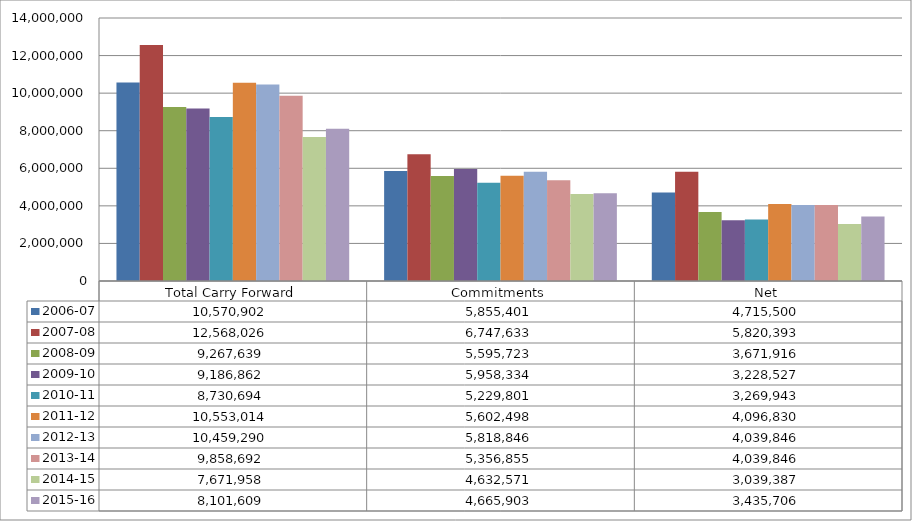
| Category | 2006-07 | 2007-08 | 2008-09 | 2009-10 | 2010-11 | 2011-12 | 2012-13 | 2013-14 | 2014-15 | 2015-16 |
|---|---|---|---|---|---|---|---|---|---|---|
| Total Carry Forward | 10570901.71 | 12568026 | 9267638.53 | 9186861.57 | 8730694 | 10553014 | 10459290 | 9858692 | 7671958.49 | 8101609.11 |
| Commitments | 5855401.23 | 6747633 | 5595723 | 5958334.08 | 5229801 | 5602498 | 5818846 | 5356855 | 4632571.25 | 4665902.66 |
| Net | 4715500.48 | 5820393 | 3671915.53 | 3228527.49 | 3269943 | 4096830 | 4039846 | 4039846 | 3039387.24 | 3435706.45 |